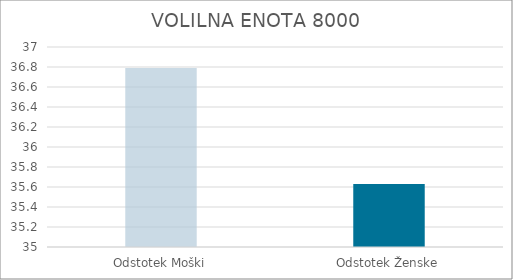
| Category | Series 0 |
|---|---|
| Odstotek Moški | 36.79 |
| Odstotek Ženske | 35.63 |